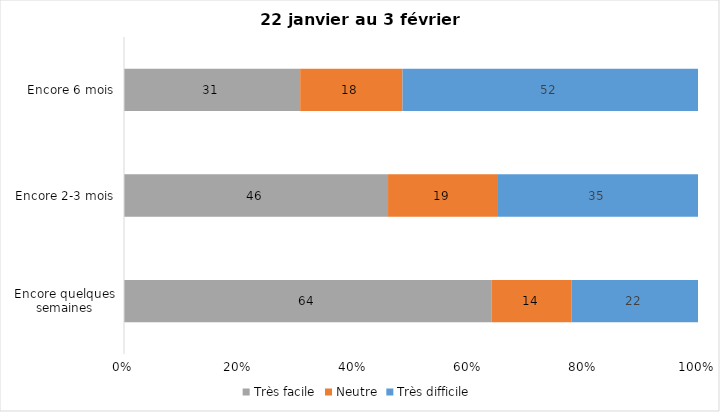
| Category | Très facile | Neutre | Très difficile |
|---|---|---|---|
| Encore quelques semaines | 64 | 14 | 22 |
| Encore 2-3 mois | 46 | 19 | 35 |
| Encore 6 mois | 31 | 18 | 52 |